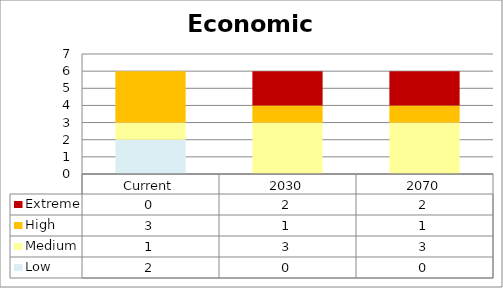
| Category | Low | Medium | High | Extreme |
|---|---|---|---|---|
| Current | 2 | 1 | 3 | 0 |
| 2030 | 0 | 3 | 1 | 2 |
| 2070 | 0 | 3 | 1 | 2 |